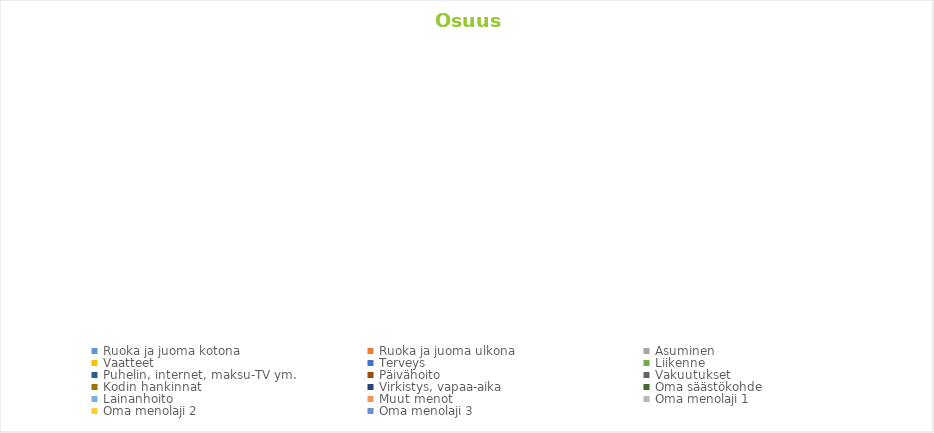
| Category | Ruoka ja juoma kotona |
|---|---|
| Ruoka ja juoma kotona | 0 |
| Ruoka ja juoma ulkona | 0 |
| Asuminen | 0 |
| Vaatteet | 0 |
| Terveys | 0 |
| Liikenne | 0 |
| Puhelin, internet, maksu-TV ym. | 0 |
| Päivähoito | 0 |
| Vakuutukset | 0 |
| Kodin hankinnat | 0 |
| Virkistys, vapaa-aika | 0 |
| Oma säästökohde | 0 |
| Lainanhoito | 0 |
| Muut menot | 0 |
| Oma menolaji 1 | 0 |
| Oma menolaji 2 | 0 |
| Oma menolaji 3 | 0 |